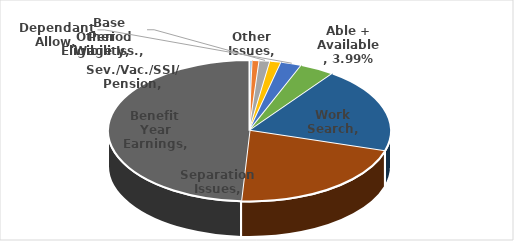
| Category | Series 0 |
|---|---|
| Other Issues | 0.003 |
| Other Eligibility | 0.008 |
| Base Period Wage Iss. | 0.012 |
| Sev./Vac./SSI/ Pension | 0.013 |
| Dependant Allow | 0.024 |
| Able + Available | 0.04 |
| Work Search | 0.197 |
| Separation Issues | 0.213 |
| Benefit Year Earnings | 0.491 |